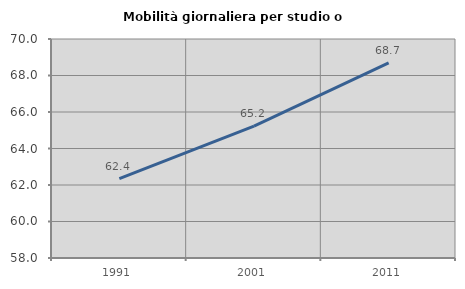
| Category | Mobilità giornaliera per studio o lavoro |
|---|---|
| 1991.0 | 62.353 |
| 2001.0 | 65.226 |
| 2011.0 | 68.694 |